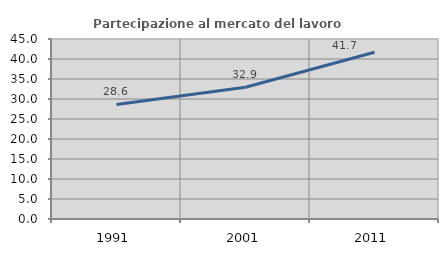
| Category | Partecipazione al mercato del lavoro  femminile |
|---|---|
| 1991.0 | 28.649 |
| 2001.0 | 32.946 |
| 2011.0 | 41.675 |